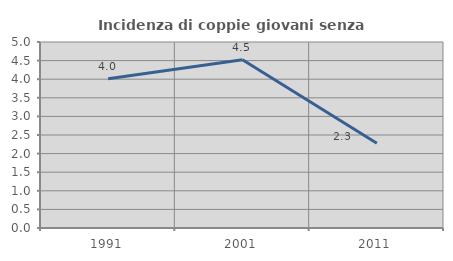
| Category | Incidenza di coppie giovani senza figli |
|---|---|
| 1991.0 | 4.014 |
| 2001.0 | 4.522 |
| 2011.0 | 2.277 |